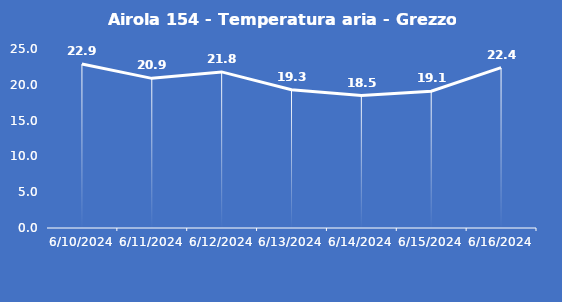
| Category | Airola 154 - Temperatura aria - Grezzo (°C) |
|---|---|
| 6/10/24 | 22.9 |
| 6/11/24 | 20.9 |
| 6/12/24 | 21.8 |
| 6/13/24 | 19.3 |
| 6/14/24 | 18.5 |
| 6/15/24 | 19.1 |
| 6/16/24 | 22.4 |